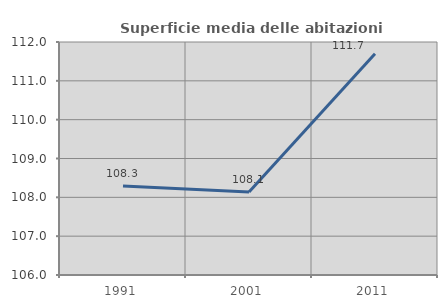
| Category | Superficie media delle abitazioni occupate |
|---|---|
| 1991.0 | 108.293 |
| 2001.0 | 108.135 |
| 2011.0 | 111.697 |